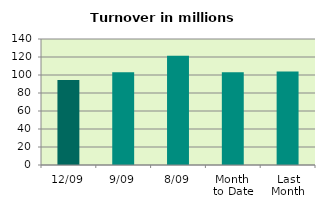
| Category | Series 0 |
|---|---|
| 12/09 | 94.473 |
| 9/09 | 103.135 |
| 8/09 | 121.487 |
| Month 
to Date | 103.021 |
| Last
Month | 103.765 |